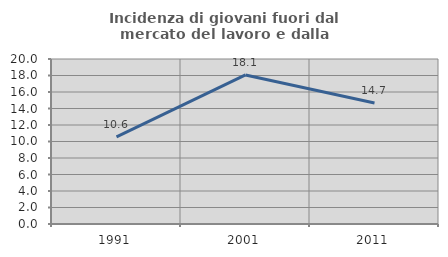
| Category | Incidenza di giovani fuori dal mercato del lavoro e dalla formazione  |
|---|---|
| 1991.0 | 10.566 |
| 2001.0 | 18.069 |
| 2011.0 | 14.658 |